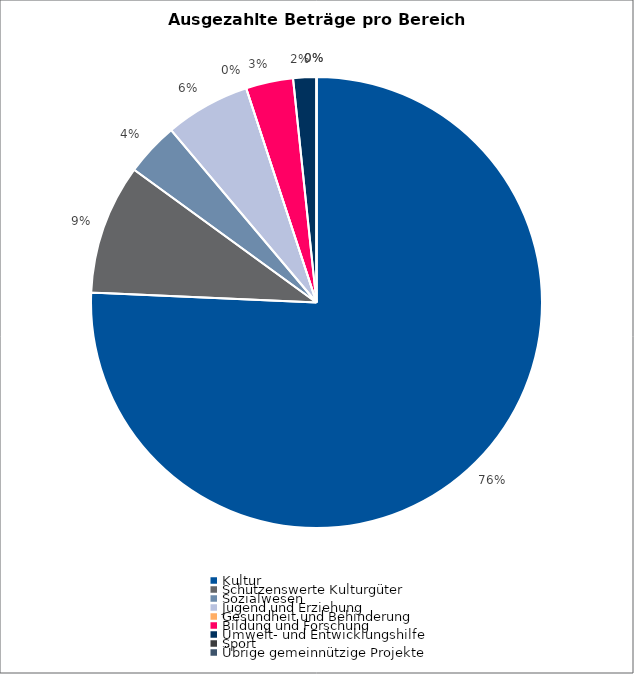
| Category | Series 0 |
|---|---|
| Kultur | 1091644 |
| Schützenswerte Kulturgüter | 134180 |
| Sozialwesen | 55300 |
| Jugend und Erziehung | 87974 |
| Gesundheit und Behinderung | 0 |
| Bildung und Forschung | 48796 |
| Umwelt- und Entwicklungshilfe | 24000 |
| Sport | 0 |
| Übrige gemeinnützige Projekte | 0 |